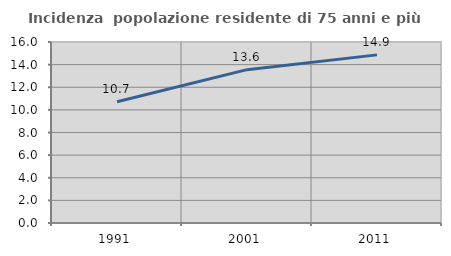
| Category | Incidenza  popolazione residente di 75 anni e più |
|---|---|
| 1991.0 | 10.723 |
| 2001.0 | 13.556 |
| 2011.0 | 14.862 |